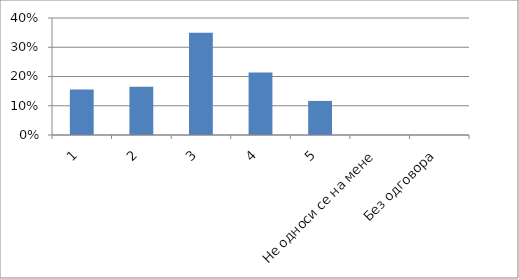
| Category | Series 0 |
|---|---|
| 1 | 0.155 |
| 2 | 0.165 |
| 3 | 0.35 |
| 4 | 0.214 |
| 5 | 0.117 |
| Не односи се на мене | 0 |
| Без одговора | 0 |